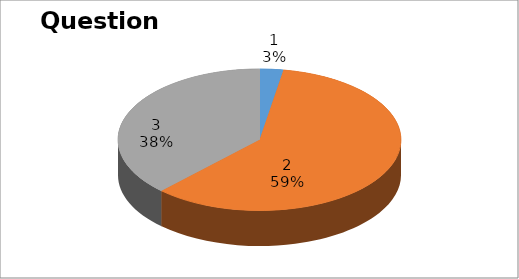
| Category | Series 0 |
|---|---|
| 0 | 1 |
| 1 | 22 |
| 2 | 14 |